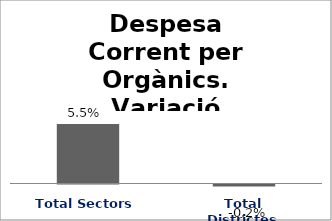
| Category | Series 0 |
|---|---|
| Total Sectors | 0.055 |
| Total Districtes | -0.002 |